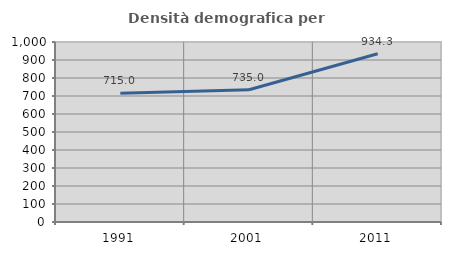
| Category | Densità demografica |
|---|---|
| 1991.0 | 715.043 |
| 2001.0 | 735.003 |
| 2011.0 | 934.339 |